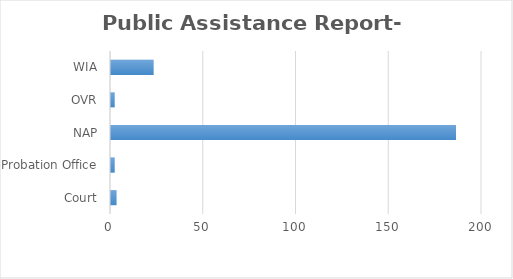
| Category | Series 0 |
|---|---|
| Court | 3 |
| Probation Office | 2 |
| NAP | 186 |
| OVR | 2 |
| WIA | 23 |